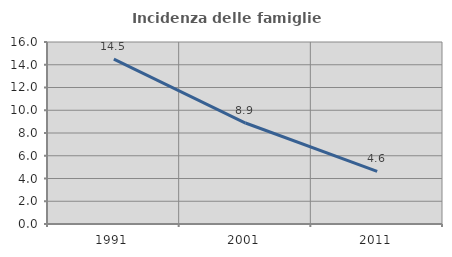
| Category | Incidenza delle famiglie numerose |
|---|---|
| 1991.0 | 14.499 |
| 2001.0 | 8.876 |
| 2011.0 | 4.622 |